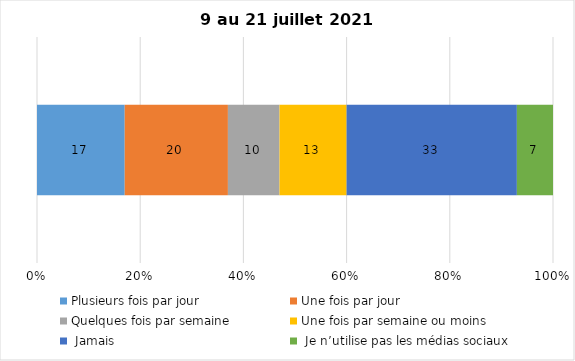
| Category | Plusieurs fois par jour | Une fois par jour | Quelques fois par semaine   | Une fois par semaine ou moins   |  Jamais   |  Je n’utilise pas les médias sociaux |
|---|---|---|---|---|---|---|
| 0 | 17 | 20 | 10 | 13 | 33 | 7 |